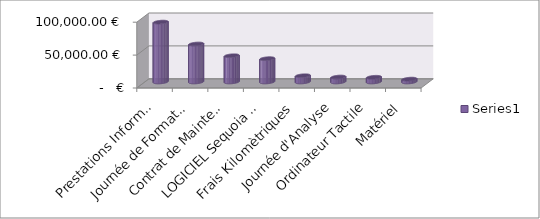
| Category | Series 0 |
|---|---|
| Prestations Informatiques | 91009.4 |
| Journée de Formation | 57732.09 |
| Contrat de Maintenance Informatique | 39909.38 |
| LOGICIEL Sequoia PR | 35470 |
| Frais Kilomètriques | 9520.67 |
| Journée d'Analyse | 7545 |
| Ordinateur Tactile | 7200 |
| Matériel | 4374.8 |